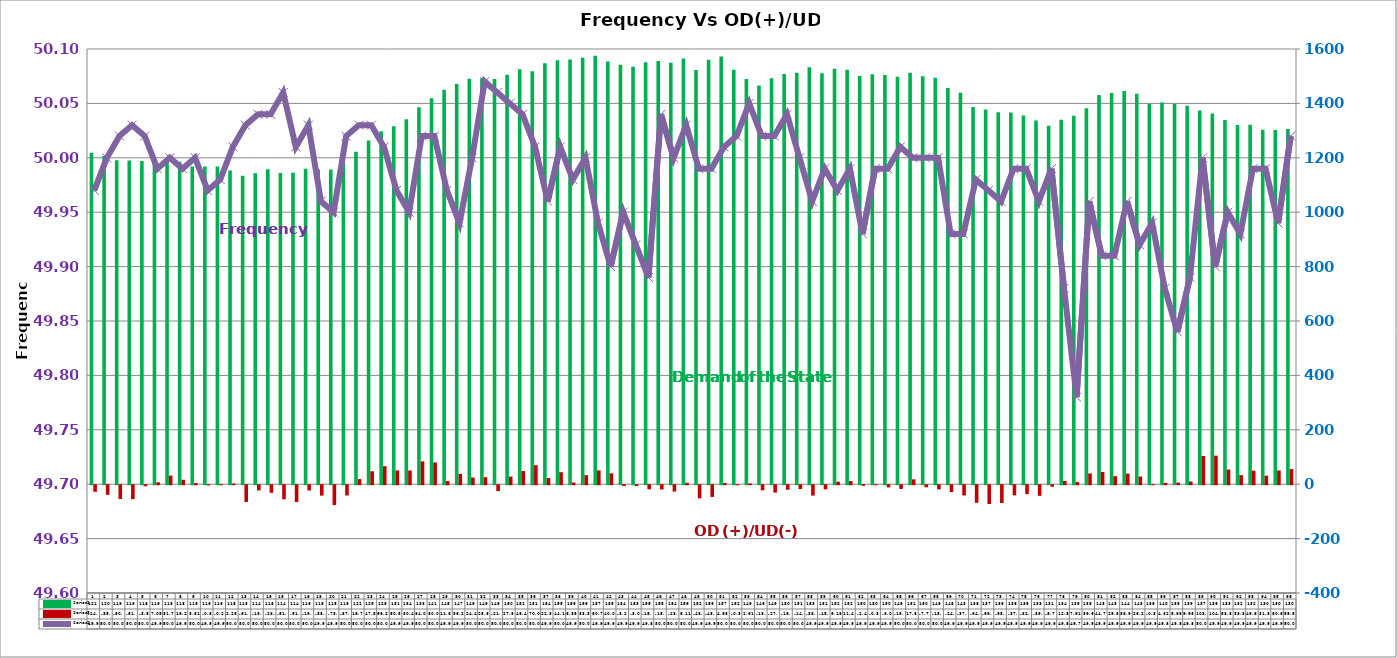
| Category | Series 2 | Series 4 |
|---|---|---|
| 0 | 1218.28 | -24.17 |
| 1 | 1207.01 | -35.3 |
| 2 | 1191.08 | -50.74 |
| 3 | 1190.39 | -51.24 |
| 4 | 1187.87 | -3.86 |
| 5 | 1189.95 | 7.05 |
| 6 | 1189.34 | 31.78 |
| 7 | 1185.91 | 16.27 |
| 8 | 1167.94 | 3.81 |
| 9 | 1167.7 | -0.85 |
| 10 | 1168.28 | -0.27 |
| 11 | 1153.41 | 2.26 |
| 12 | 1134.07 | -61.55 |
| 13 | 1142.75 | -19.23 |
| 14 | 1157.62 | -28.07 |
| 15 | 1144.12 | -51.98 |
| 16 | 1145.33 | -61.7 |
| 17 | 1159.99 | -19.47 |
| 18 | 1157.36 | -38.26 |
| 19 | 1157.25 | -73.24 |
| 20 | 1181.62 | -37.81 |
| 21 | 1222.39 | 18.73 |
| 22 | 1263.41 | 47.55 |
| 23 | 1297.22 | 66.21 |
| 24 | 1315.7 | 50.59 |
| 25 | 1341.46 | 50.42 |
| 26 | 1385.41 | 84.01 |
| 27 | 1418.55 | 80.08 |
| 28 | 1450.44 | 11.6 |
| 29 | 1470.88 | 38.21 |
| 30 | 1490.48 | 24.48 |
| 31 | 1491.99 | 25.64 |
| 32 | 1489.5 | -21.84 |
| 33 | 1505.36 | 27.98 |
| 34 | 1525.31 | 48.41 |
| 35 | 1518.61 | 70.02 |
| 36 | 1547.22 | 22.39 |
| 37 | 1558.6 | 44.13 |
| 38 | 1561.4 | 6.35 |
| 39 | 1567.52 | 33.39 |
| 40 | 1575.62 | 50.75 |
| 41 | 1554.4 | 40 |
| 42 | 1541.94 | -3.27 |
| 43 | 1535.04 | -3.02 |
| 44 | 1551.4 | -15.26 |
| 45 | 1555.92 | -15.6 |
| 46 | 1549.05 | -23.48 |
| 47 | 1565.03 | 5.11 |
| 48 | 1522.81 | -48.18 |
| 49 | 1560.69 | -43.1 |
| 50 | 1572.4 | 4.68 |
| 51 | 1523.91 | -0.36 |
| 52 | 1489.92 | 2.61 |
| 53 | 1465.9 | -18.68 |
| 54 | 1492.17 | -27.08 |
| 55 | 1507.83 | -16.61 |
| 56 | 1513.06 | -14.15 |
| 57 | 1533.04 | -38.32 |
| 58 | 1510.59 | -15.21 |
| 59 | 1527.33 | 9.19 |
| 60 | 1523.89 | 11.42 |
| 61 | 1500.68 | -2.4 |
| 62 | 1507.25 | -0.36 |
| 63 | 1504.34 | -8.01 |
| 64 | 1498.02 | -13.76 |
| 65 | 1512.23 | 17.86 |
| 66 | 1499.82 | -7.74 |
| 67 | 1494.02 | -15.5 |
| 68 | 1456.3 | -24.97 |
| 69 | 1439.18 | -37.68 |
| 70 | 1386.83 | -64.82 |
| 71 | 1377.3 | -69.18 |
| 72 | 1367.71 | -65.34 |
| 73 | 1366.92 | -37.43 |
| 74 | 1355.85 | -32.86 |
| 75 | 1337.15 | -39.16 |
| 76 | 1317.58 | -5.73 |
| 77 | 1340.06 | 12.3 |
| 78 | 1354.58 | 7.91 |
| 79 | 1382.12 | 39.6 |
| 80 | 1431 | 44.75 |
| 81 | 1438.62 | 29.55 |
| 82 | 1445.78 | 38.96 |
| 83 | 1435.35 | 28.26 |
| 84 | 1398.91 | -0.38 |
| 85 | 1403.53 | 4.82 |
| 86 | 1397.69 | 5.98 |
| 87 | 1391.1 | 9.96 |
| 88 | 1373.87 | 103.92 |
| 89 | 1362.42 | 104.9 |
| 90 | 1339.32 | 53.8 |
| 91 | 1320.64 | 33.39 |
| 92 | 1321.49 | 49.6 |
| 93 | 1303.22 | 31.37 |
| 94 | 1302.4 | 50.63 |
| 95 | 1305.44 | 55.54 |